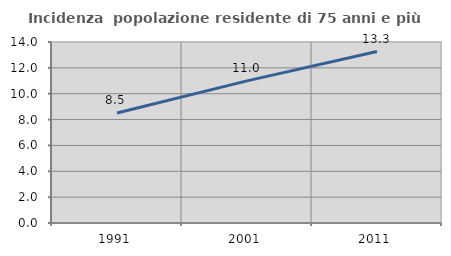
| Category | Incidenza  popolazione residente di 75 anni e più |
|---|---|
| 1991.0 | 8.503 |
| 2001.0 | 10.993 |
| 2011.0 | 13.265 |